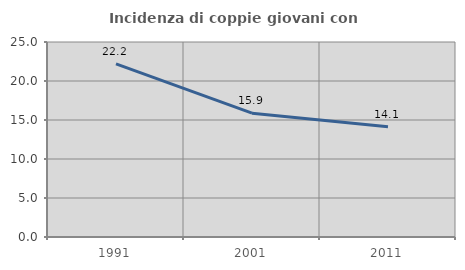
| Category | Incidenza di coppie giovani con figli |
|---|---|
| 1991.0 | 22.198 |
| 2001.0 | 15.876 |
| 2011.0 | 14.139 |